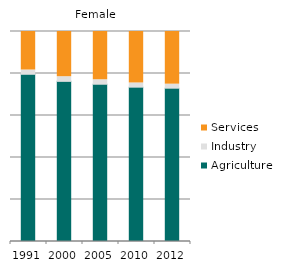
| Category | Agriculture | Industry | Services |
|---|---|---|---|
| 1991.0 | 79.625 | 2.04 | 18.335 |
| 2000.0 | 76.257 | 2.222 | 21.52 |
| 2005.0 | 74.888 | 2.14 | 22.972 |
| 2010.0 | 73.496 | 2.007 | 24.497 |
| 2012.0 | 73.004 | 1.92 | 25.076 |